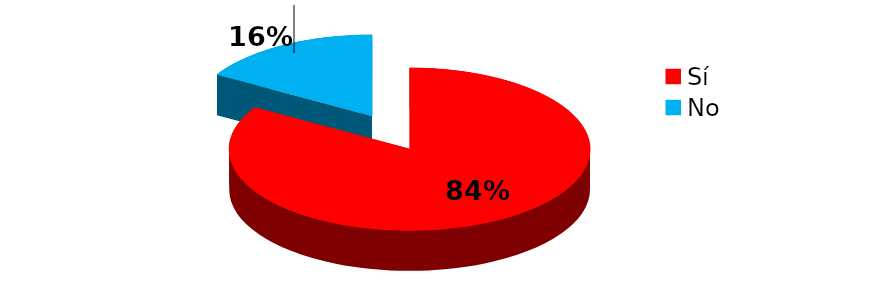
| Category | Series 0 |
|---|---|
| Sí | 274 |
| No | 54 |